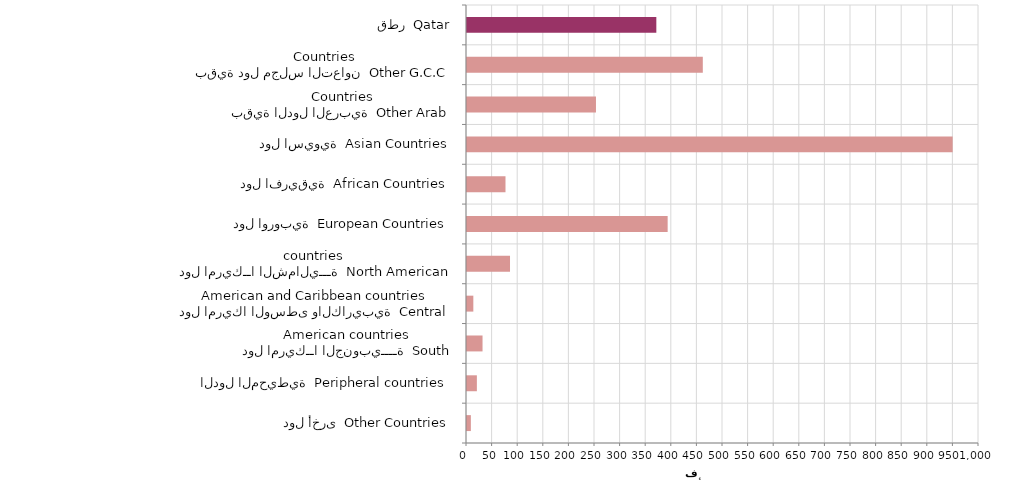
| Category | Series 0 |
|---|---|
| دول أخرى  Other Countries | 7530 |
| الدول المحيطية  Peripheral countries | 19284 |
| دول امريكــا الجنوبيــــة  South American countries | 30337 |
| دول امريكا الوسطى والكاريبية  Central American and Caribbean countries | 12362 |
| دول امريكــا الشماليـــة  North American countries  | 83998 |
| دول اوروبية  European Countries | 391902 |
| دول افريقية  African Countries | 75184 |
| دول اسيوية  Asian Countries | 948520 |
| بقية الدول العربية  Other Arab Countries | 251903 |
| بقية دول مجلس التعاون  Other G.C.C Countries | 460562 |
| قطر  Qatar | 369792 |